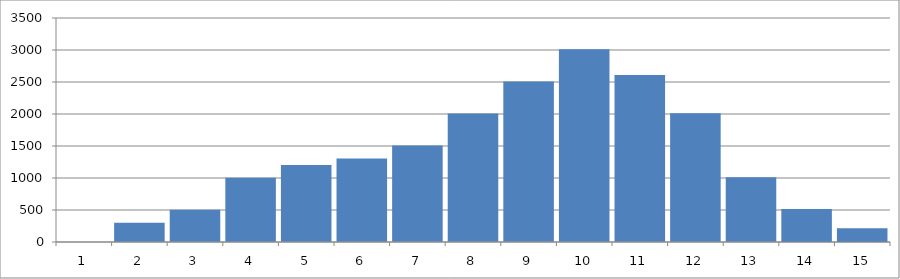
| Category | Blocs | altitude (m) |
|---|---|---|
| 0 | 1 | 0 |
| 1 | 2 | 300 |
| 2 | 3 | 500 |
| 3 | 4 | 1000 |
| 4 | 5 | 1200 |
| 5 | 6 | 1300 |
| 6 | 7 | 1500 |
| 7 | 8 | 2000 |
| 8 | 9 | 2500 |
| 9 | 10 | 3000 |
| 10 | 11 | 2600 |
| 11 | 12 | 2000 |
| 12 | 13 | 1000 |
| 13 | 14 | 500 |
| 14 | 15 | 200 |